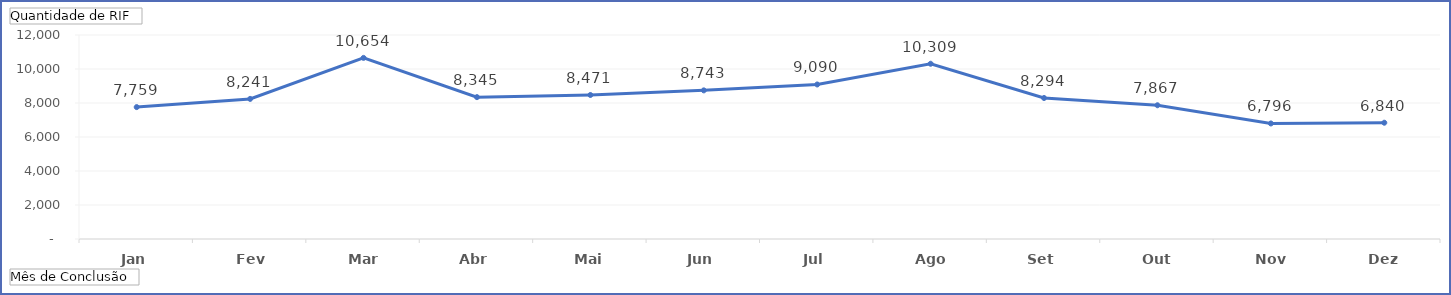
| Category | Total |
|---|---|
| Jan | 7759 |
| Fev | 8241 |
| Mar | 10654 |
| Abr | 8345 |
| Mai | 8471 |
| Jun | 8743 |
| Jul | 9090 |
| Ago | 10309 |
| Set | 8294 |
| Out | 7867 |
| Nov | 6796 |
| Dez | 6840 |